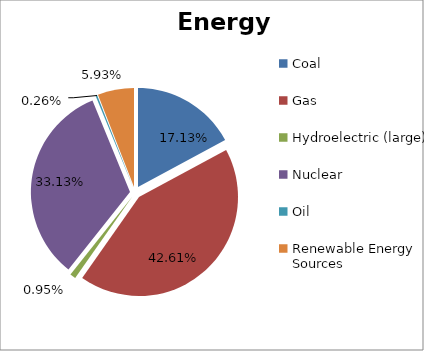
| Category | Energy Source |
|---|---|
| Coal | 0.171 |
| Gas | 0.426 |
| Hydroelectric (large) | 0.009 |
| Nuclear | 0.331 |
| Oil | 0.003 |
| Renewable Energy Sources | 0.059 |